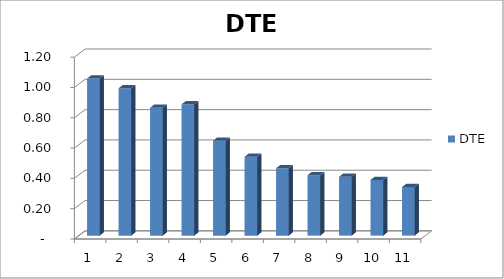
| Category | DTE |
|---|---|
| 0 | 1.037 |
| 1 | 0.972 |
| 2 | 0.844 |
| 3 | 0.867 |
| 4 | 0.627 |
| 5 | 0.521 |
| 6 | 0.445 |
| 7 | 0.399 |
| 8 | 0.389 |
| 9 | 0.368 |
| 10 | 0.321 |